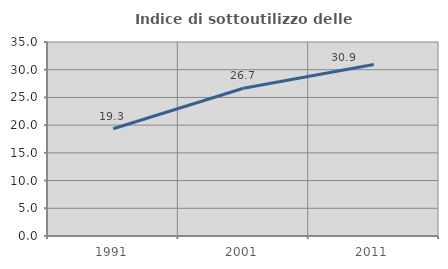
| Category | Indice di sottoutilizzo delle abitazioni  |
|---|---|
| 1991.0 | 19.345 |
| 2001.0 | 26.664 |
| 2011.0 | 30.932 |